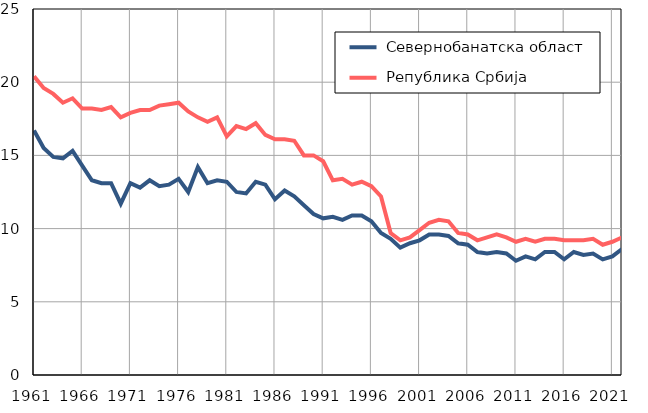
| Category |  Севернобанатска област |  Република Србија |
|---|---|---|
| 1961.0 | 16.7 | 20.4 |
| 1962.0 | 15.5 | 19.6 |
| 1963.0 | 14.9 | 19.2 |
| 1964.0 | 14.8 | 18.6 |
| 1965.0 | 15.3 | 18.9 |
| 1966.0 | 14.3 | 18.2 |
| 1967.0 | 13.3 | 18.2 |
| 1968.0 | 13.1 | 18.1 |
| 1969.0 | 13.1 | 18.3 |
| 1970.0 | 11.7 | 17.6 |
| 1971.0 | 13.1 | 17.9 |
| 1972.0 | 12.8 | 18.1 |
| 1973.0 | 13.3 | 18.1 |
| 1974.0 | 12.9 | 18.4 |
| 1975.0 | 13 | 18.5 |
| 1976.0 | 13.4 | 18.6 |
| 1977.0 | 12.5 | 18 |
| 1978.0 | 14.2 | 17.6 |
| 1979.0 | 13.1 | 17.3 |
| 1980.0 | 13.3 | 17.6 |
| 1981.0 | 13.2 | 16.3 |
| 1982.0 | 12.5 | 17 |
| 1983.0 | 12.4 | 16.8 |
| 1984.0 | 13.2 | 17.2 |
| 1985.0 | 13 | 16.4 |
| 1986.0 | 12 | 16.1 |
| 1987.0 | 12.6 | 16.1 |
| 1988.0 | 12.2 | 16 |
| 1989.0 | 11.6 | 15 |
| 1990.0 | 11 | 15 |
| 1991.0 | 10.7 | 14.6 |
| 1992.0 | 10.8 | 13.3 |
| 1993.0 | 10.6 | 13.4 |
| 1994.0 | 10.9 | 13 |
| 1995.0 | 10.9 | 13.2 |
| 1996.0 | 10.5 | 12.9 |
| 1997.0 | 9.7 | 12.2 |
| 1998.0 | 9.3 | 9.7 |
| 1999.0 | 8.7 | 9.2 |
| 2000.0 | 9 | 9.4 |
| 2001.0 | 9.2 | 9.9 |
| 2002.0 | 9.6 | 10.4 |
| 2003.0 | 9.6 | 10.6 |
| 2004.0 | 9.5 | 10.5 |
| 2005.0 | 9 | 9.7 |
| 2006.0 | 8.9 | 9.6 |
| 2007.0 | 8.4 | 9.2 |
| 2008.0 | 8.3 | 9.4 |
| 2009.0 | 8.4 | 9.6 |
| 2010.0 | 8.3 | 9.4 |
| 2011.0 | 7.8 | 9.1 |
| 2012.0 | 8.1 | 9.3 |
| 2013.0 | 7.9 | 9.1 |
| 2014.0 | 8.4 | 9.3 |
| 2015.0 | 8.4 | 9.3 |
| 2016.0 | 7.9 | 9.2 |
| 2017.0 | 8.4 | 9.2 |
| 2018.0 | 8.2 | 9.2 |
| 2019.0 | 8.3 | 9.3 |
| 2020.0 | 7.9 | 8.9 |
| 2021.0 | 8.1 | 9.1 |
| 2022.0 | 8.6 | 9.4 |